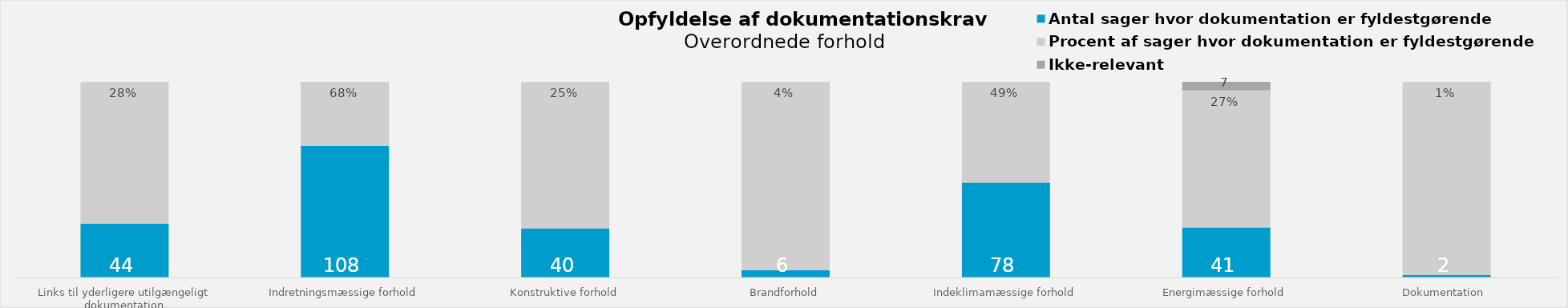
| Category | Antal sager hvor dokumentation er fyldestgørende | Procent af sager hvor dokumentation er fyldestgørende | %-andel | Ikke-relevant |
|---|---|---|---|---|
| Links til yderligere utilgængeligt dokumentation | 44 | 116 | 0.275 | 0 |
| Indretningsmæssige forhold | 108 | 52 | 0.675 | 0 |
| Konstruktive forhold | 40 | 120 | 0.25 | 0 |
| Brandforhold | 6 | 154 | 0.038 | 0 |
| Indeklimamæssige forhold | 78 | 82 | 0.488 | 0 |
| Energimæssige forhold | 41 | 112 | 0.268 | 7 |
| Dokumentation  | 2 | 158 | 0.012 | 0 |